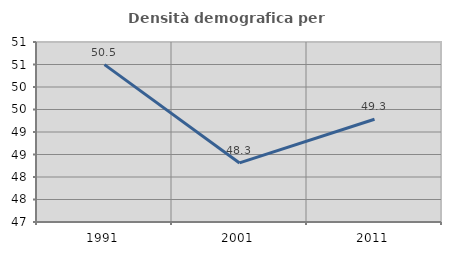
| Category | Densità demografica |
|---|---|
| 1991.0 | 50.498 |
| 2001.0 | 48.313 |
| 2011.0 | 49.284 |